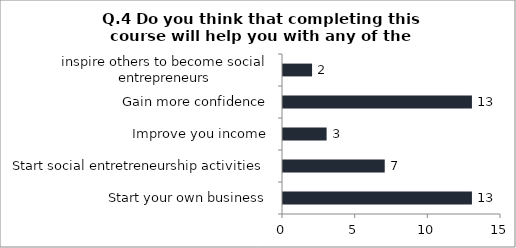
| Category | Q.4 Do you think that completing this course will help you with any of the followoing ? |
|---|---|
| Start your own business | 13 |
| Start social entretreneurship activities | 7 |
| Improve you income | 3 |
| Gain more confidence | 13 |
| inspire others to become social entrepreneurs | 2 |